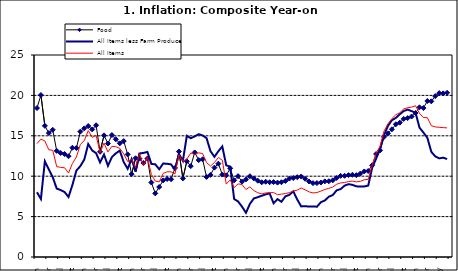
| Category | Food | All Items less Farm Produce | All Items |
|---|---|---|---|
| 09-Jan | 18.436 | 8.013 | 14.034 |
| Feb | 20.041 | 7.178 | 14.584 |
| Mar | 16.233 | 11.842 | 14.366 |
| Apr | 15.342 | 10.85 | 13.268 |
| May | 15.74 | 9.88 | 13.212 |
| June | 13.138 | 8.472 | 11.194 |
| Jul | 12.867 | 8.285 | 11.09 |
| Aug | 12.746 | 8.044 | 11.046 |
| Sep | 12.472 | 7.431 | 10.39 |
| Oct | 13.524 | 8.933 | 11.588 |
| Nov | 13.482 | 10.702 | 12.368 |
| Dec | 15.518 | 11.249 | 13.93 |
| 10-Jan | 15.918 | 12.063 | 14.398 |
| Feb | 16.208 | 13.978 | 15.649 |
| Mar | 15.79 | 13.184 | 14.812 |
| Apr | 16.306 | 12.844 | 15.044 |
| May | 13.023 | 11.711 | 12.915 |
| Jun | 15.053 | 12.686 | 14.099 |
| Jul | 14.043 | 11.287 | 13.002 |
| Aug | 15.09 | 12.366 | 13.702 |
| Sep | 14.57 | 12.83 | 13.65 |
| Oct | 14.065 | 13.168 | 13.45 |
| Nov | 14.351 | 11.746 | 12.766 |
| Dec | 12.701 | 10.917 | 11.815 |
| 11-Jan | 10.255 | 12.118 | 12.08 |
| Feb | 12.221 | 10.569 | 11.1 |
| Mar | 12.169 | 12.815 | 12.779 |
| Apr | 11.629 | 12.882 | 11.291 |
| May | 12.179 | 13.006 | 12.352 |
| Jun | 9.22 | 11.524 | 10.23 |
| Jul | 7.877 | 11.472 | 9.397 |
| Aug | 8.665 | 10.863 | 9.301 |
| Sep | 9.479 | 11.567 | 10.339 |
| Oct | 9.656 | 11.539 | 10.544 |
| Nov | 9.623 | 11.459 | 10.54 |
| Dec | 11.02 | 10.822 | 10.283 |
| 12-Jan | 13.053 | 12.748 | 12.626 |
| 12-Feb | 9.729 | 11.901 | 11.866 |
| 12-Mar | 11.848 | 14.995 | 12.111 |
| Apr | 11.246 | 14.703 | 12.866 |
| May | 12.942 | 14.926 | 12.688 |
| Jun | 11.991 | 15.199 | 12.892 |
| Jul | 12.093 | 15.045 | 12.797 |
| Aug | 9.91 | 14.714 | 11.689 |
| Sep | 10.164 | 13.101 | 11.253 |
| Oct | 11.064 | 12.398 | 11.693 |
| Nov | 11.553 | 13.092 | 12.32 |
| Dec | 10.199 | 13.685 | 11.981 |
| 13-Jan | 10.106 | 11.342 | 9.031 |
| Feb | 10.973 | 11.184 | 9.542 |
| Mar | 9.482 | 7.179 | 8.593 |
| Apr | 10.006 | 6.874 | 9.052 |
| May | 9.321 | 6.227 | 8.964 |
| Jun | 9.606 | 5.472 | 8.353 |
| Jul | 9.994 | 6.58 | 8.682 |
| Aug | 9.723 | 7.245 | 8.231 |
| Sep | 9.437 | 7.41 | 7.952 |
| Oct | 9.249 | 7.579 | 7.807 |
| Nov | 9.313 | 7.75 | 7.931 |
| Dec | 9.253 | 7.872 | 7.957 |
| 14-Jan | 9.271 | 6.648 | 7.977 |
| Feb | 9.207 | 7.166 | 7.707 |
| Mar | 9.254 | 6.836 | 7.783 |
| Apr | 9.414 | 7.508 | 7.851 |
| May | 9.698 | 7.693 | 7.965 |
| Jun | 9.776 | 8.122 | 8.167 |
| Jul | 9.878 | 7.116 | 8.281 |
| Aug | 9.959 | 6.264 | 8.534 |
| Sep | 9.676 | 6.278 | 8.317 |
| Oct | 9.343 | 6.252 | 8.06 |
| Nov | 9.144 | 6.255 | 7.927 |
| Dec | 9.152 | 6.225 | 7.978 |
| 15-Jan | 9.215 | 6.787 | 8.157 |
| Feb | 9.359 | 6.994 | 8.359 |
| Mar | 9.376 | 7.46 | 8.494 |
| Apr | 9.49 | 7.661 | 8.655 |
| May | 9.782 | 8.253 | 9.003 |
| Jun | 10.041 | 8.403 | 9.168 |
| Jul | 10.049 | 8.83 | 9.218 |
| Aug | 10.131 | 9.01 | 9.336 |
| Sep | 10.174 | 8.928 | 9.394 |
| Oct | 10.129 | 8.742 | 9.296 |
| Nov | 10.321 | 8.732 | 9.368 |
| Dec | 10.588 | 8.727 | 9.554 |
| 16-Jan | 10.642 | 8.841 | 9.617 |
| Feb | 11.348 | 11.041 | 11.379 |
| Mar | 12.745 | 12.17 | 12.775 |
| Apr | 13.194 | 13.352 | 13.721 |
| May | 14.861 | 15.054 | 15.577 |
| Jun | 15.302 | 16.224 | 16.48 |
| Jul | 15.799 | 16.929 | 17.127 |
| Aug | 16.427 | 17.208 | 17.609 |
| Sep | 16.622 | 17.666 | 17.852 |
| Oct | 17.09 | 18.067 | 18.33 |
| Nov | 17.191 | 18.241 | 18.476 |
| Dec | 17.388 | 18.052 | 18.547 |
| 17-Jan | 17.818 | 17.867 | 18.719 |
| Feb | 18.528 | 16.011 | 17.78 |
| Mar | 18.436 | 15.404 | 17.256 |
| Apr | 19.303 | 14.75 | 17.244 |
| May | 19.266 | 13.016 | 16.251 |
| June | 19.915 | 12.455 | 16.098 |
| July | 20.284 | 12.207 | 16.053 |
| August | 20.251 | 12.296 | 16.012 |
| September | 20.321 | 12.123 | 15.979 |